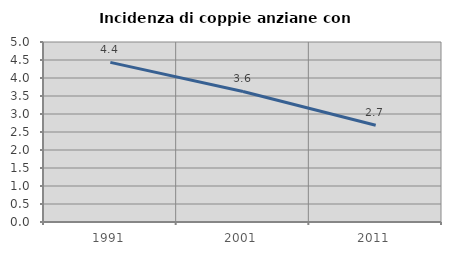
| Category | Incidenza di coppie anziane con figli |
|---|---|
| 1991.0 | 4.433 |
| 2001.0 | 3.627 |
| 2011.0 | 2.688 |